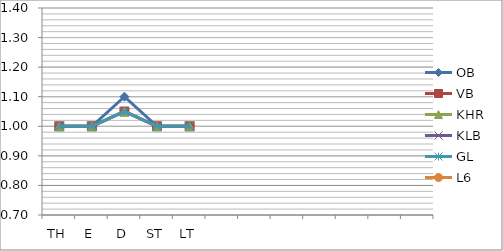
| Category | OB | VB | KHR | KLB | GL | L6 |
|---|---|---|---|---|---|---|
| TH | 1 | 1 | 1 | 1 | 1 |  |
| E | 1 | 1 | 1 | 1 | 1 |  |
| D | 1.1 | 1.05 | 1.05 | 1.05 | 1.05 |  |
| ST | 1 | 1 | 1 | 1 | 1 |  |
| LT | 1 | 1 | 1 | 1 | 1 |  |